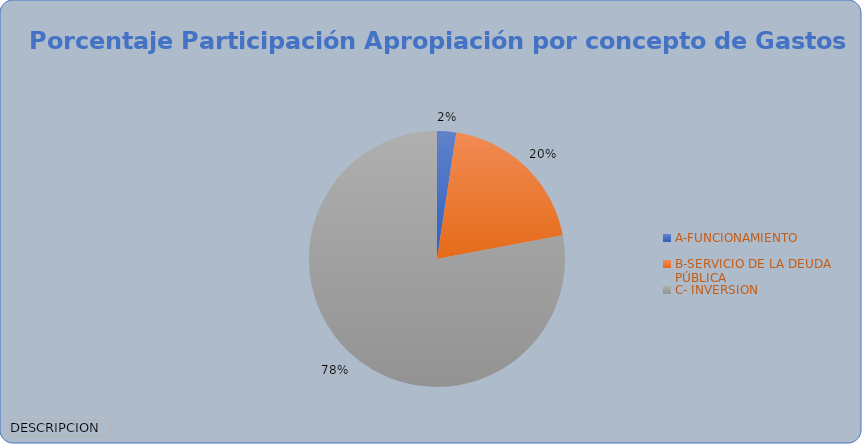
| Category | Total |
|---|---|
| A-FUNCIONAMIENTO | 74780.665 |
| B-SERVICIO DE LA DEUDA PÚBLICA | 608283.882 |
| C- INVERSION | 2418788.029 |